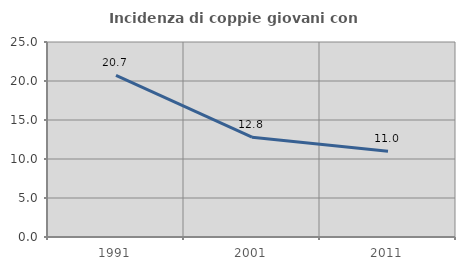
| Category | Incidenza di coppie giovani con figli |
|---|---|
| 1991.0 | 20.714 |
| 2001.0 | 12.796 |
| 2011.0 | 10.999 |